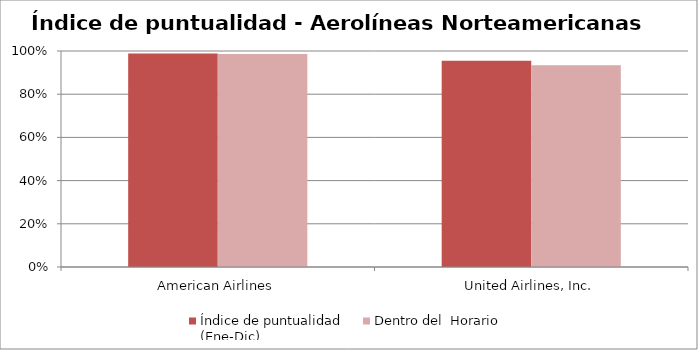
| Category | Índice de puntualidad
(Ene-Dic) | Dentro del  Horario |
|---|---|---|
| American Airlines | 0.988 | 0.987 |
| United Airlines, Inc. | 0.955 | 0.935 |